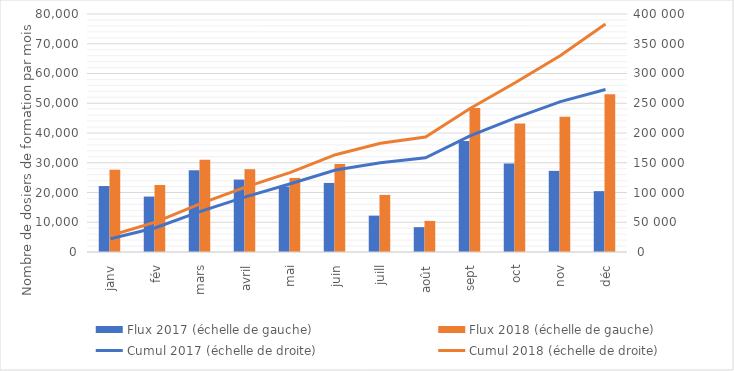
| Category | Flux 2017 (échelle de gauche) | Flux 2018 (échelle de gauche) |
|---|---|---|
| janv | 22172 | 27656 |
| fév | 18631 | 22526 |
| mars | 27476 | 31032 |
| avril | 24347 | 27832 |
| mai | 21986 | 24897 |
| juin | 23220 | 29554 |
| juill | 12223 | 19192 |
| août | 8348 | 10450 |
| sept | 37277 | 48414 |
| oct | 29747 | 43190 |
| nov | 27276 | 45464 |
| déc | 20463 | 53012 |